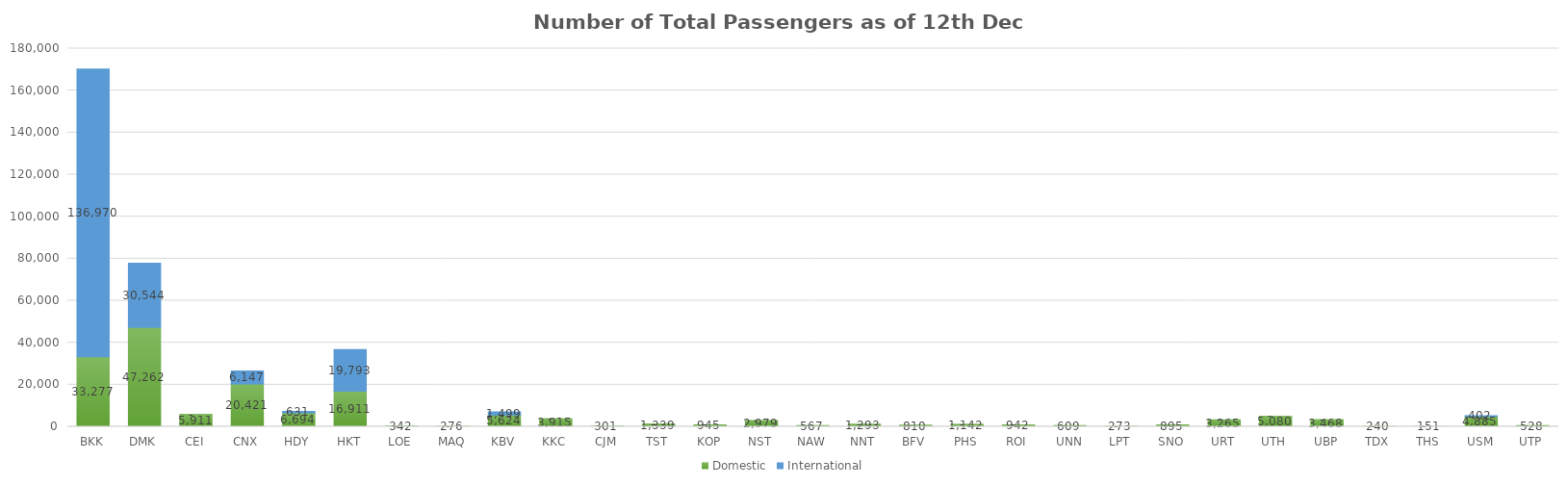
| Category | Domestic | International |
|---|---|---|
| BKK | 33277 | 136970 |
| DMK | 47262 | 30544 |
| CEI | 5911 | 0 |
| CNX | 20421 | 6147 |
| HDY | 6694 | 631 |
| HKT | 16911 | 19793 |
| LOE | 342 | 0 |
| MAQ | 276 | 0 |
| KBV | 5624 | 1499 |
| KKC | 3915 | 0 |
| CJM | 301 | 0 |
| TST | 1339 | 0 |
| KOP | 945 | 0 |
| NST | 2979 | 0 |
| NAW | 567 | 0 |
| NNT | 1293 | 0 |
| BFV | 810 | 0 |
| PHS | 1142 | 0 |
| ROI | 942 | 0 |
| UNN | 609 | 0 |
| LPT | 273 | 0 |
| SNO | 895 | 0 |
| URT | 3265 | 0 |
| UTH | 5080 | 0 |
| UBP | 3468 | 0 |
| TDX | 240 | 0 |
| THS | 151 | 0 |
| USM | 4885 | 402 |
| UTP | 528 | 0 |